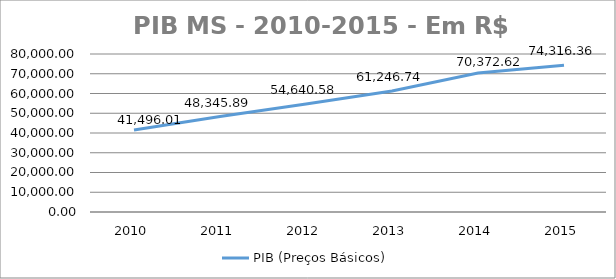
| Category | PIB (Preços Básicos) |
|---|---|
| 2010.0 | 41496.01 |
| 2011.0 | 48345.89 |
| 2012.0 | 54640.58 |
| 2013.0 | 61246.74 |
| 2014.0 | 70372.62 |
| 2015.0 | 74316.36 |